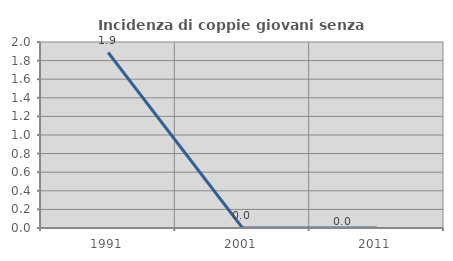
| Category | Incidenza di coppie giovani senza figli |
|---|---|
| 1991.0 | 1.887 |
| 2001.0 | 0 |
| 2011.0 | 0 |